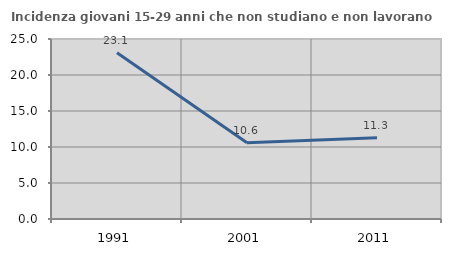
| Category | Incidenza giovani 15-29 anni che non studiano e non lavorano  |
|---|---|
| 1991.0 | 23.077 |
| 2001.0 | 10.593 |
| 2011.0 | 11.298 |